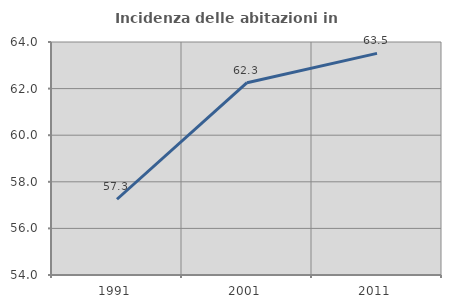
| Category | Incidenza delle abitazioni in proprietà  |
|---|---|
| 1991.0 | 57.251 |
| 2001.0 | 62.254 |
| 2011.0 | 63.51 |